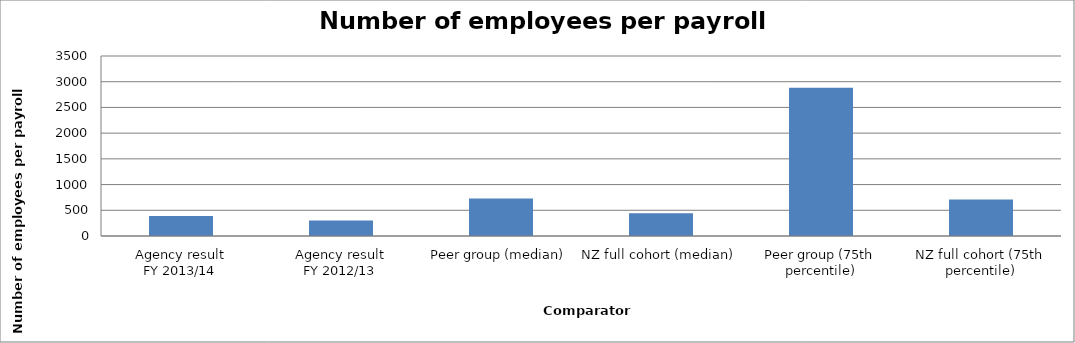
| Category | Result |
|---|---|
| Agency result
FY 2013/14 | 390.351 |
| Agency result
FY 2012/13 | 301.492 |
| Peer group (median) | 727.5 |
| NZ full cohort (median) | 443.678 |
| Peer group (75th percentile) | 2882.143 |
| NZ full cohort (75th percentile) | 708.598 |